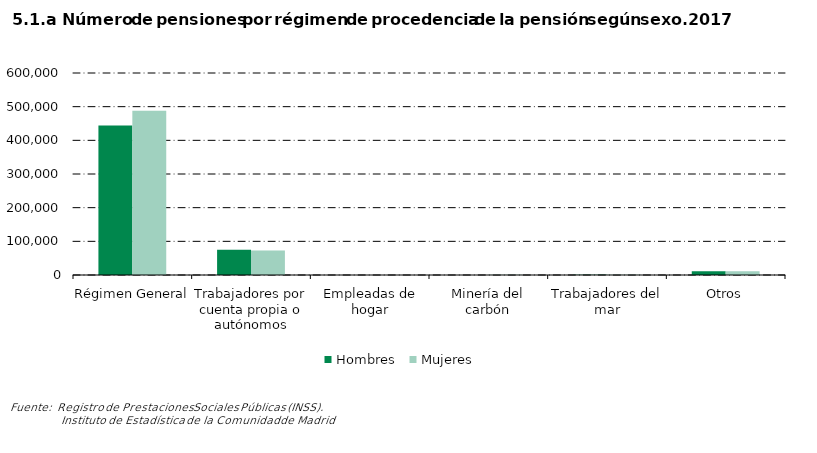
| Category | Hombres | Mujeres |
|---|---|---|
| Régimen General | 444105 | 488007 |
| Trabajadores por cuenta propia o autónomos | 75100 | 72447 |
| Empleadas de hogar | 0 | 0 |
| Minería del carbón | 280 | 372 |
| Trabajadores del mar | 693 | 665 |
| Otros | 11317 | 11336 |